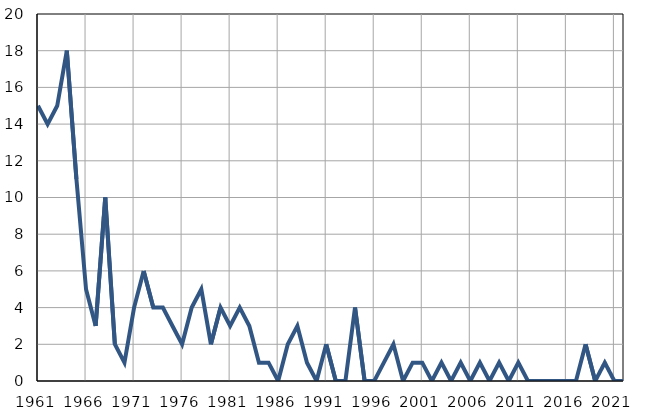
| Category | Infants
deaths |
|---|---|
| 1961.0 | 15 |
| 1962.0 | 14 |
| 1963.0 | 15 |
| 1964.0 | 18 |
| 1965.0 | 11 |
| 1966.0 | 5 |
| 1967.0 | 3 |
| 1968.0 | 10 |
| 1969.0 | 2 |
| 1970.0 | 1 |
| 1971.0 | 4 |
| 1972.0 | 6 |
| 1973.0 | 4 |
| 1974.0 | 4 |
| 1975.0 | 3 |
| 1976.0 | 2 |
| 1977.0 | 4 |
| 1978.0 | 5 |
| 1979.0 | 2 |
| 1980.0 | 4 |
| 1981.0 | 3 |
| 1982.0 | 4 |
| 1983.0 | 3 |
| 1984.0 | 1 |
| 1985.0 | 1 |
| 1986.0 | 0 |
| 1987.0 | 2 |
| 1988.0 | 3 |
| 1989.0 | 1 |
| 1990.0 | 0 |
| 1991.0 | 2 |
| 1992.0 | 0 |
| 1993.0 | 0 |
| 1994.0 | 4 |
| 1995.0 | 0 |
| 1996.0 | 0 |
| 1997.0 | 1 |
| 1998.0 | 2 |
| 1999.0 | 0 |
| 2000.0 | 1 |
| 2001.0 | 1 |
| 2002.0 | 0 |
| 2003.0 | 1 |
| 2004.0 | 0 |
| 2005.0 | 1 |
| 2006.0 | 0 |
| 2007.0 | 1 |
| 2008.0 | 0 |
| 2009.0 | 1 |
| 2010.0 | 0 |
| 2011.0 | 1 |
| 2012.0 | 0 |
| 2013.0 | 0 |
| 2014.0 | 0 |
| 2015.0 | 0 |
| 2016.0 | 0 |
| 2017.0 | 0 |
| 2018.0 | 2 |
| 2019.0 | 0 |
| 2020.0 | 1 |
| 2021.0 | 0 |
| 2022.0 | 0 |